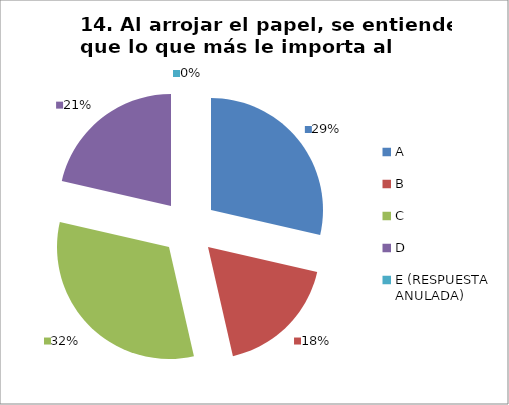
| Category | CANTIDAD DE RESPUESTAS PREGUNTA (14) | PORCENTAJE |
|---|---|---|
| A | 8 | 0.286 |
| B | 5 | 0.179 |
| C | 9 | 0.321 |
| D | 6 | 0.214 |
| E (RESPUESTA ANULADA) | 0 | 0 |